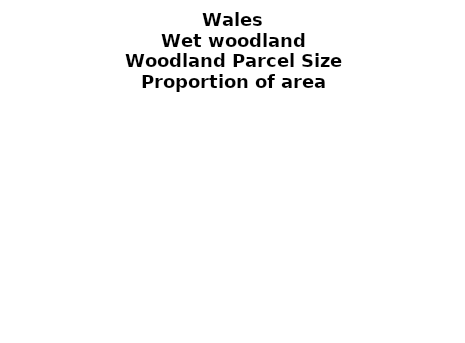
| Category | Wet woodland |
|---|---|
| <5 ha | 0.383 |
| ≥5 and <10 ha | 0.121 |
| ≥10 and <15 ha | 0.064 |
| ≥15 and <20 ha | 0.064 |
| ≥20 and <25 ha | 0.026 |
| ≥25 and <30 ha | 0.007 |
| ≥30 and <35 ha | 0.036 |
| ≥35 and <40 ha | 0.018 |
| ≥40 and <45 ha | 0.001 |
| ≥45 and <50 ha | 0.008 |
| ≥50 and <60 ha | 0.02 |
| ≥60 and <70 ha | 0.015 |
| ≥70 and <80 ha | 0 |
| ≥80 and <90 ha | 0.022 |
| ≥90 and <100 ha | 0.014 |
| ≥100 and <150 ha | 0.041 |
| ≥150 and <200 ha | 0.002 |
| ≥200 ha | 0.155 |